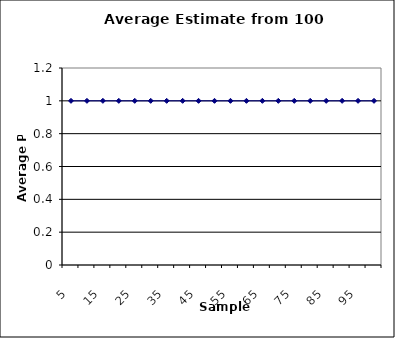
| Category | Series 0 |
|---|---|
| 5.0 | 1 |
| 10.0 | 1 |
| 15.0 | 1 |
| 20.0 | 1 |
| 25.0 | 1 |
| 30.0 | 1 |
| 35.0 | 1 |
| 40.0 | 1 |
| 45.0 | 1 |
| 50.0 | 1 |
| 55.0 | 1 |
| 60.0 | 1 |
| 65.0 | 1 |
| 70.0 | 1 |
| 75.0 | 1 |
| 80.0 | 1 |
| 85.0 | 1 |
| 90.0 | 1 |
| 95.0 | 1 |
| 100.0 | 1 |